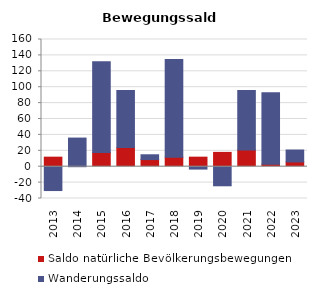
| Category | Saldo natürliche Bevölkerungsbewegungen | Wanderungssaldo |
|---|---|---|
| 2013.0 | 12 | -30 |
| 2014.0 | 0 | 36 |
| 2015.0 | 18 | 114 |
| 2016.0 | 24 | 72 |
| 2017.0 | 9 | 6 |
| 2018.0 | 12 | 123 |
| 2019.0 | 12 | -3 |
| 2020.0 | 18 | -24 |
| 2021.0 | 21 | 75 |
| 2022.0 | 3 | 90 |
| 2023.0 | 6 | 15 |